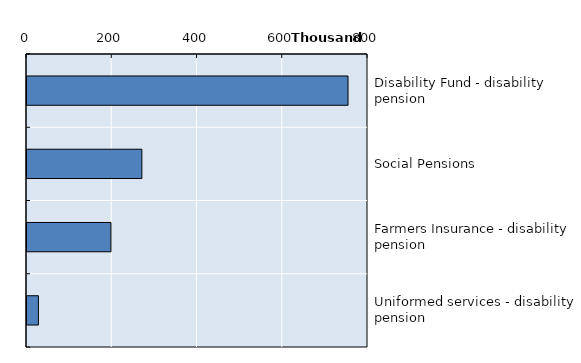
| Category | Series 0 |
|---|---|
| Disability Fund - disability pension | 753123 |
| Social Pensions | 269470 |
| Farmers Insurance - disability pension | 196947 |
| Uniformed services - disability pension | 26783 |